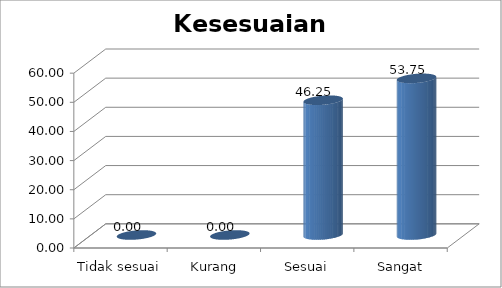
| Category | Kesesuaian Persyaratan |
|---|---|
| Tidak sesuai | 0 |
| Kurang sesuai | 0 |
| Sesuai | 46.25 |
| Sangat sesuai | 53.75 |